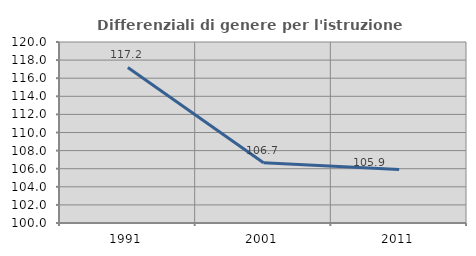
| Category | Differenziali di genere per l'istruzione superiore |
|---|---|
| 1991.0 | 117.189 |
| 2001.0 | 106.661 |
| 2011.0 | 105.919 |